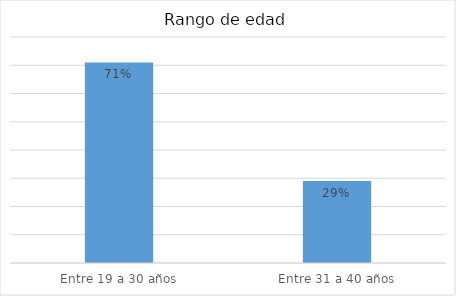
| Category | Series 0 |
|---|---|
| Entre 19 a 30 años | 0.71 |
| Entre 31 a 40 años | 0.29 |